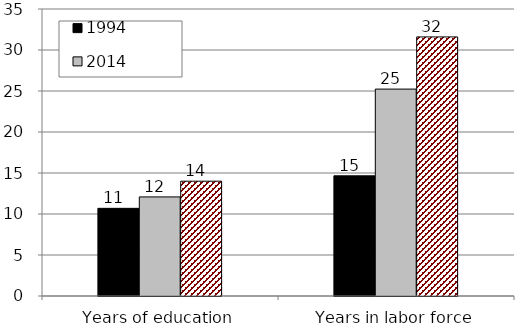
| Category | 1994 | 2014 | Projected 2029 |
|---|---|---|---|
| Years of education | 10.691 | 12.083 | 14 |
| Years in labor force | 14.655 | 25.233 | 31.596 |